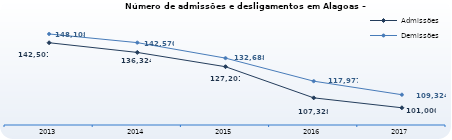
| Category | Admissões | Demissões |
|---|---|---|
| 2013.0 | 142501 | 148108 |
| 2014.0 | 136324 | 142570 |
| 2015.0 | 127201 | 132688 |
| 2016.0 | 107328 | 117977 |
| 2017.0 | 101000 | 109324 |